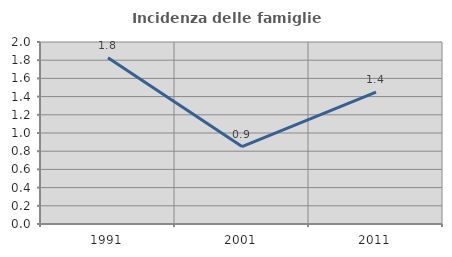
| Category | Incidenza delle famiglie numerose |
|---|---|
| 1991.0 | 1.826 |
| 2001.0 | 0.851 |
| 2011.0 | 1.448 |